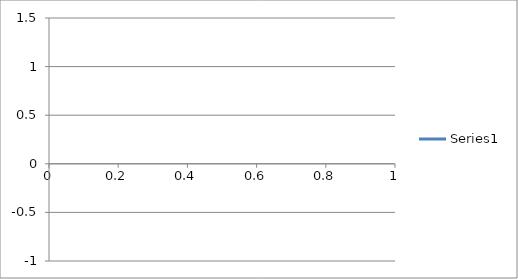
| Category | Series 0 |
|---|---|
| 0 | -0.75 |
| 1 | -0.682 |
| 2 | -0.608 |
| 3 | -0.53 |
| 4 | -0.448 |
| 5 | -0.363 |
| 6 | -0.275 |
| 7 | -0.184 |
| 8 | -0.092 |
| 9 | 0 |
| 10 | 0.092 |
| 11 | 0.184 |
| 12 | 0.275 |
| 13 | 0.363 |
| 14 | 0.448 |
| 15 | 0.53 |
| 16 | 0.608 |
| 17 | 0.682 |
| 18 | 0.75 |
| 19 | 0.813 |
| 20 | 0.869 |
| 21 | 0.919 |
| 22 | 0.961 |
| 23 | 0.997 |
| 24 | 1.025 |
| 25 | 1.045 |
| 26 | 1.057 |
| 27 | 1.061 |
| 28 | 1.057 |
| 29 | 1.045 |
| 30 | 1.025 |
| 31 | 0.997 |
| 32 | 0.961 |
| 33 | 0.919 |
| 34 | 0.869 |
| 35 | 0.813 |
| 36 | 0.75 |
| 37 | 0.682 |
| 38 | 0.608 |
| 39 | 0.53 |
| 40 | 0.448 |
| 41 | 0.363 |
| 42 | 0.275 |
| 43 | 0.184 |
| 44 | 0.092 |
| 45 | 0 |
| 46 | -0.092 |
| 47 | -0.184 |
| 48 | -0.275 |
| 49 | -0.363 |
| 50 | -0.448 |
| 51 | -0.53 |
| 52 | -0.608 |
| 53 | -0.682 |
| 54 | -0.75 |